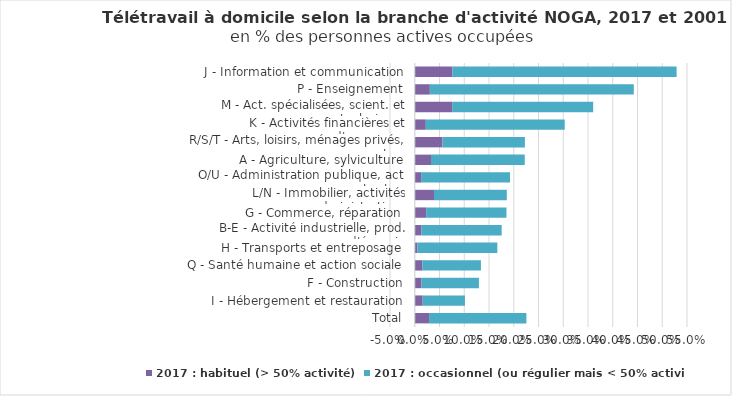
| Category | 2017 : habituel (> 50% activité) | 2017 : occasionnel (ou régulier mais < 50% activité) |
|---|---|---|
| Total | 0.029 | 0.197 |
| I - Hébergement et restauration | 0.016 | 0.085 |
| F - Construction | 0.014 | 0.116 |
| Q - Santé humaine et action sociale | 0.016 | 0.118 |
| H - Transports et entreposage | 0.005 | 0.161 |
| B-E - Activité industrielle, prod. d'énergie | 0.014 | 0.162 |
| G - Commerce, réparation | 0.023 | 0.162 |
| L/N - Immobilier, activités administratives | 0.039 | 0.147 |
| O/U - Administration publique, act. extra-ter. | 0.013 | 0.18 |
| A - Agriculture, sylviculture | 0.033 | 0.189 |
| R/S/T - Arts, loisirs, ménages privés, autres | 0.056 | 0.167 |
| K - Activités financières et d'assurance | 0.022 | 0.281 |
| M - Act. spécialisées, scient. et techniques | 0.076 | 0.285 |
| P - Enseignement | 0.03 | 0.412 |
| J - Information et communication | 0.076 | 0.453 |